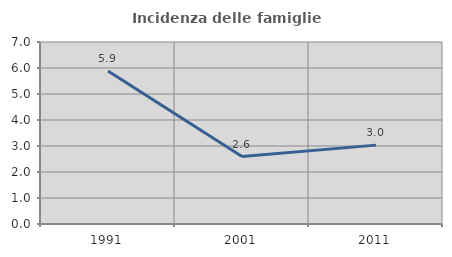
| Category | Incidenza delle famiglie numerose |
|---|---|
| 1991.0 | 5.882 |
| 2001.0 | 2.594 |
| 2011.0 | 3.033 |